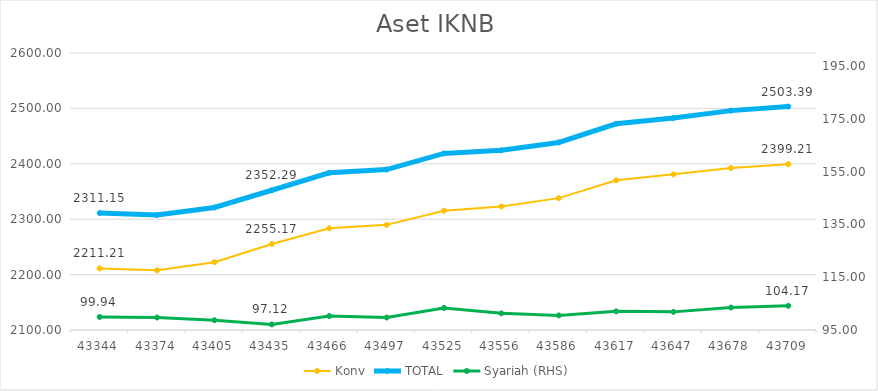
| Category | Konv | TOTAL |
|---|---|---|
| 2018-09-01 | 2211.208 | 2311.146 |
| 2018-10-01 | 2207.768 | 2307.509 |
| 2018-11-01 | 2222.478 | 2321.18 |
| 2018-12-01 | 2255.172 | 2352.287 |
| 2019-01-01 | 2283.536 | 2383.836 |
| 2019-02-01 | 2289.807 | 2389.536 |
| 2019-03-01 | 2315.383 | 2418.739 |
| 2019-04-01 | 2323.04 | 2424.36 |
| 2019-05-01 | 2338.007 | 2438.533 |
| 2019-06-01 | 2370.128 | 2472.191 |
| 2019-07-01 | 2380.927 | 2482.798 |
| 2019-08-01 | 2392.476 | 2495.993 |
| 2019-09-01 | 2399.214 | 2503.387 |